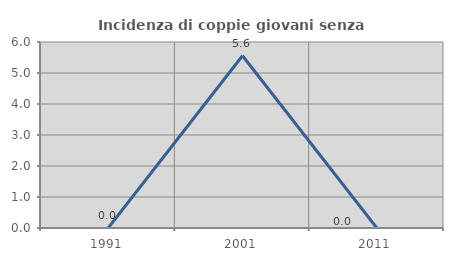
| Category | Incidenza di coppie giovani senza figli |
|---|---|
| 1991.0 | 0 |
| 2001.0 | 5.556 |
| 2011.0 | 0 |